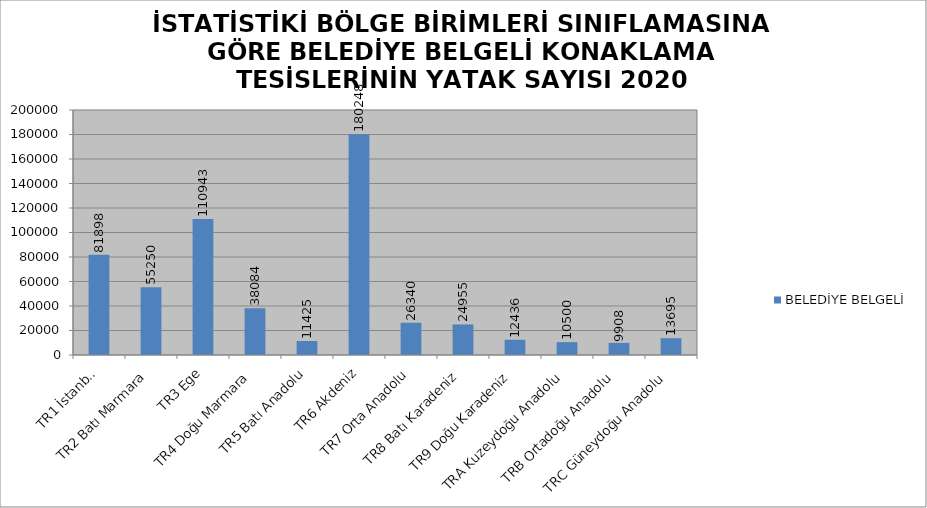
| Category | BELEDİYE BELGELİ |
|---|---|
| TR1 İstanbul | 81898 |
| TR2 Batı Marmara | 55250 |
| TR3 Ege | 110943 |
| TR4 Doğu Marmara | 38084 |
| TR5 Batı Anadolu | 11425 |
| TR6 Akdeniz | 180248 |
| TR7 Orta Anadolu | 26340 |
| TR8 Batı Karadeniz | 24955 |
| TR9 Doğu Karadeniz | 12436 |
| TRA Kuzeydoğu Anadolu | 10500 |
| TRB Ortadoğu Anadolu | 9908 |
| TRC Güneydoğu Anadolu | 13695 |